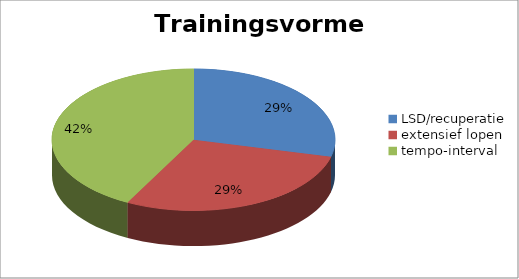
| Category | Series 0 |
|---|---|
| LSD/recuperatie | 75 |
| extensief lopen | 75 |
| tempo-interval | 110 |